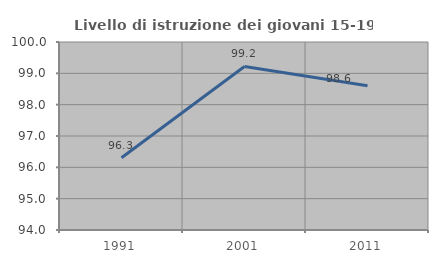
| Category | Livello di istruzione dei giovani 15-19 anni |
|---|---|
| 1991.0 | 96.304 |
| 2001.0 | 99.219 |
| 2011.0 | 98.601 |